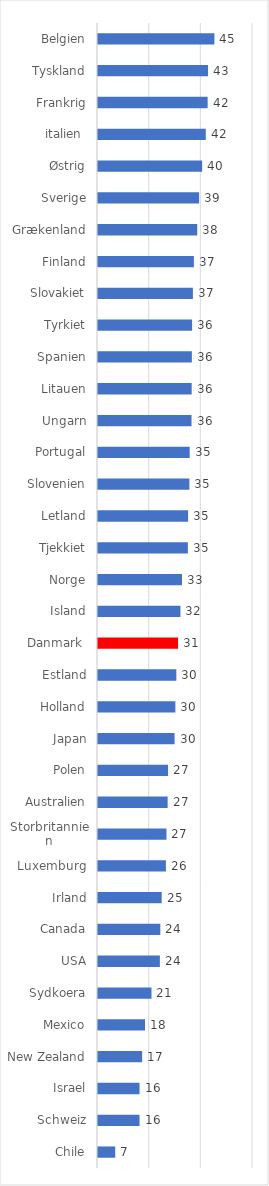
| Category | Series 0 |
|---|---|
| Chile | 6.666 |
| Schweiz | 16.078 |
| Israel | 16.078 |
| New Zealand | 17.088 |
| Mexico | 18.2 |
| Sydkoera | 20.708 |
| USA | 23.949 |
| Canada | 24.122 |
| Irland | 24.656 |
| Luxemburg | 26.289 |
| Storbritannien | 26.513 |
| Australien | 26.961 |
| Polen | 27.126 |
| Japan | 29.64 |
| Holland | 29.946 |
| Estland | 30.326 |
| Danmark  | 30.994 |
| Island | 31.908 |
| Norge | 32.517 |
| Tjekkiet | 34.787 |
| Letland | 34.878 |
| Slovenien | 35.372 |
| Portugal | 35.49 |
| Ungarn | 36.202 |
| Litauen | 36.265 |
| Spanien | 36.335 |
| Tyrkiet | 36.429 |
| Slovakiet | 36.733 |
| Finland | 37.116 |
| Grækenland | 38.417 |
| Sverige | 39.132 |
| Østrig | 40.314 |
| italien  | 41.726 |
| Frankrig | 42.443 |
| Tyskland | 42.598 |
| Belgien | 45.059 |